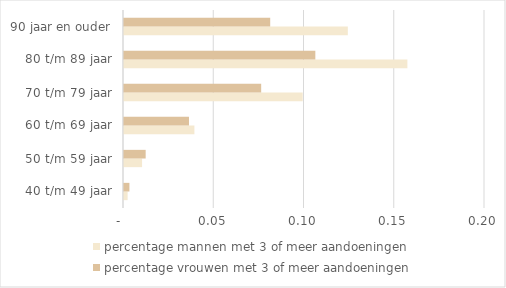
| Category | percentage mannen met 3 of meer aandoeningen | percentage vrouwen met 3 of meer aandoeningen |
|---|---|---|
| 40 t/m 49 jaar | 0.002 | 0.003 |
| 50 t/m 59 jaar | 0.01 | 0.012 |
| 60 t/m 69 jaar | 0.039 | 0.036 |
| 70 t/m 79 jaar | 0.099 | 0.076 |
| 80 t/m 89 jaar | 0.157 | 0.106 |
| 90 jaar en ouder | 0.124 | 0.081 |